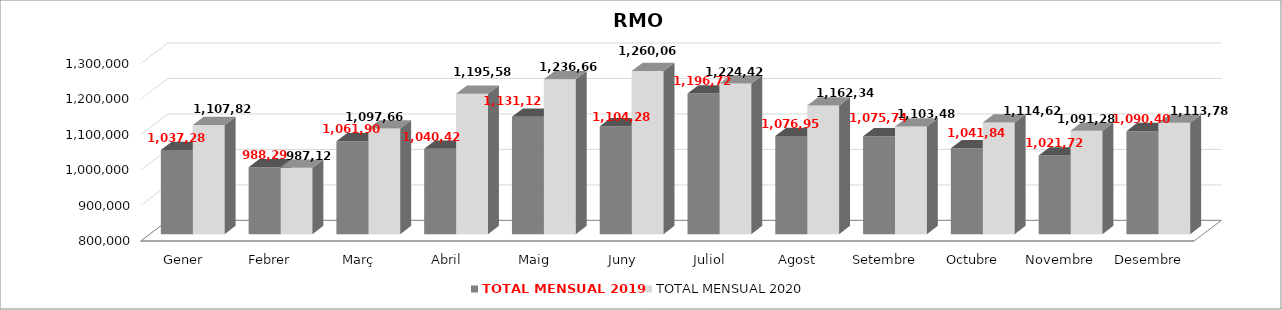
| Category | TOTAL MENSUAL 2019 | TOTAL MENSUAL 2020 |
|---|---|---|
| Gener | 1037280.01 | 1107820 |
| Febrer | 988299 | 987120 |
| Març | 1061900 | 1097660 |
| Abril | 1040420 | 1195580 |
| Maig | 1131120 | 1236660 |
| Juny | 1104280 | 1260060.1 |
| Juliol | 1196720 | 1224420 |
| Agost | 1076958.82 | 1162340 |
| Setembre | 1075740 | 1103480 |
| Octubre | 1041840 | 1114620 |
| Novembre | 1021720 | 1091280 |
| Desembre | 1090399.99 | 1113780 |